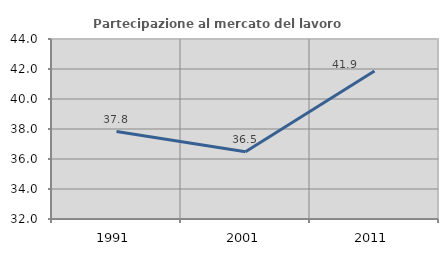
| Category | Partecipazione al mercato del lavoro  femminile |
|---|---|
| 1991.0 | 37.832 |
| 2001.0 | 36.487 |
| 2011.0 | 41.861 |